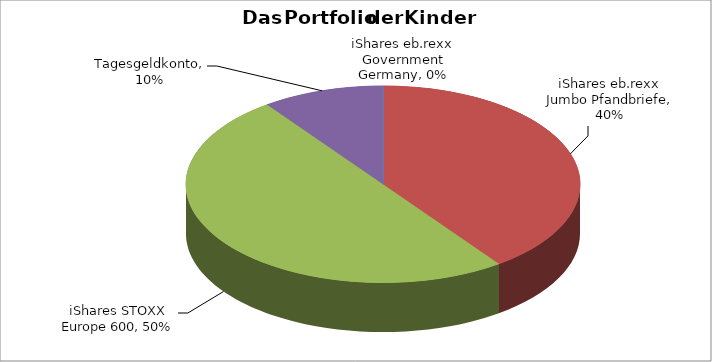
| Category | Series 0 |
|---|---|
| iShares eb.rexx Government Germany | 0 |
| iShares eb.rexx Jumbo Pfandbriefe | 0.4 |
| iShares STOXX Europe 600 | 0.5 |
| Tagesgeldkonto | 0.1 |